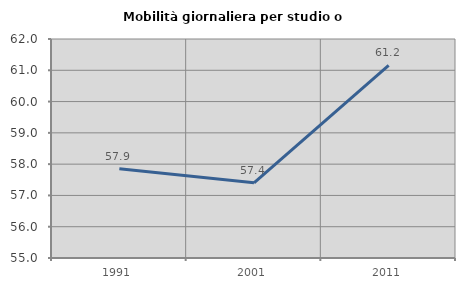
| Category | Mobilità giornaliera per studio o lavoro |
|---|---|
| 1991.0 | 57.854 |
| 2001.0 | 57.402 |
| 2011.0 | 61.154 |